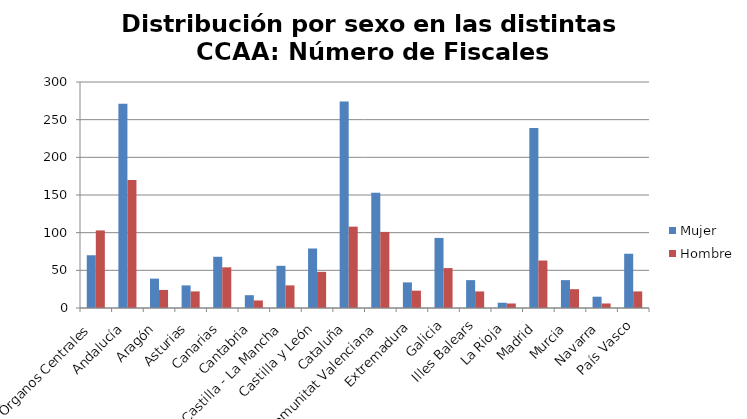
| Category | Mujer | Hombre |
|---|---|---|
| Órganos Centrales | 70 | 103 |
| Andalucía | 271 | 170 |
| Aragón | 39 | 24 |
| Asturias | 30 | 22 |
| Canarias | 68 | 54 |
| Cantabria | 17 | 10 |
| Castilla - La Mancha | 56 | 30 |
| Castilla y León | 79 | 48 |
| Cataluña | 274 | 108 |
| Comunitat Valenciana | 153 | 101 |
| Extremadura | 34 | 23 |
| Galicia | 93 | 53 |
| Illes Balears | 37 | 22 |
| La Rioja | 7 | 6 |
| Madrid | 239 | 63 |
| Murcia | 37 | 25 |
| Navarra | 15 | 6 |
| País Vasco | 72 | 22 |